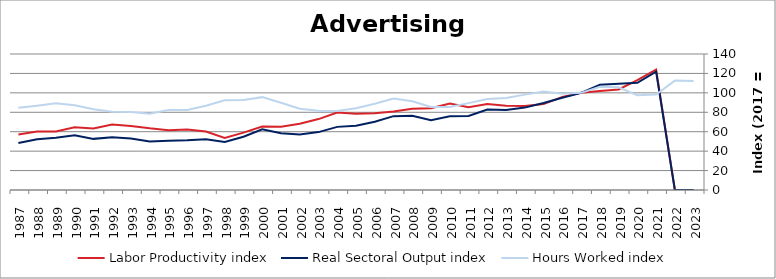
| Category | Labor Productivity index | Real Sectoral Output index | Hours Worked index |
|---|---|---|---|
| 2023.0 | 0 | 0 | 112.279 |
| 2022.0 | 0 | 0 | 112.616 |
| 2021.0 | 123.969 | 121.779 | 98.233 |
| 2020.0 | 113.211 | 110.335 | 97.459 |
| 2019.0 | 103.455 | 109.459 | 105.803 |
| 2018.0 | 101.823 | 108.297 | 106.358 |
| 2017.0 | 100 | 100 | 100 |
| 2016.0 | 95.807 | 94.936 | 99.09 |
| 2015.0 | 88.417 | 89.607 | 101.347 |
| 2014.0 | 86.407 | 84.827 | 98.172 |
| 2013.0 | 86.855 | 82.327 | 94.787 |
| 2012.0 | 88.477 | 82.93 | 93.731 |
| 2011.0 | 85.27 | 76.267 | 89.442 |
| 2010.0 | 88.908 | 75.987 | 85.466 |
| 2009.0 | 84.198 | 71.879 | 85.37 |
| 2008.0 | 83.596 | 76.391 | 91.382 |
| 2007.0 | 80.817 | 76.047 | 94.097 |
| 2006.0 | 79.067 | 70.216 | 88.807 |
| 2005.0 | 78.482 | 66.111 | 84.237 |
| 2004.0 | 79.787 | 64.98 | 81.442 |
| 2003.0 | 73.001 | 59.607 | 81.652 |
| 2002.0 | 68.218 | 57.097 | 83.698 |
| 2001.0 | 65.094 | 58.423 | 89.751 |
| 2000.0 | 65.408 | 62.524 | 95.59 |
| 1999.0 | 59.081 | 54.781 | 92.721 |
| 1998.0 | 53.486 | 49.443 | 92.44 |
| 1997.0 | 60.165 | 52.178 | 86.724 |
| 1996.0 | 62.194 | 51.156 | 82.251 |
| 1995.0 | 61.564 | 50.704 | 82.361 |
| 1994.0 | 63.459 | 49.851 | 78.556 |
| 1993.0 | 65.997 | 53.05 | 80.382 |
| 1992.0 | 67.483 | 54.405 | 80.621 |
| 1991.0 | 63.389 | 52.635 | 83.035 |
| 1990.0 | 64.525 | 56.324 | 87.291 |
| 1989.0 | 60.333 | 53.826 | 89.216 |
| 1988.0 | 60.204 | 52.237 | 86.766 |
| 1987.0 | 57.123 | 48.322 | 84.594 |